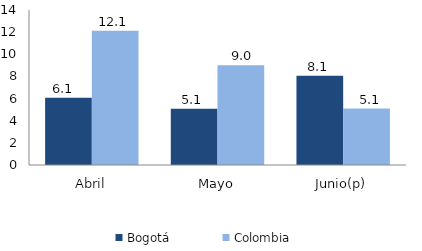
| Category | Bogotá | Colombia |
|---|---|---|
| Abril | 6.083 | 12.136 |
| Mayo | 5.088 | 9.014 |
| Junio(p) | 8.072 | 5.094 |